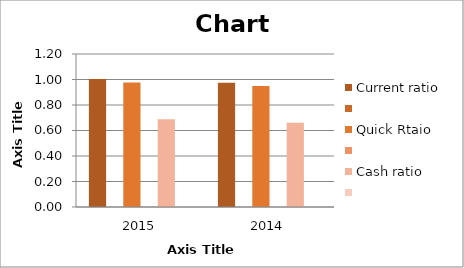
| Category | Current ratio  | Series 1 | Quick Rtaio  | Series 3 | Cash ratio | Series 5 |
|---|---|---|---|---|---|---|
| 2015.0 | 1.003 |  | 0.977 |  | 0.688 |  |
| 2014.0 | 0.974 |  | 0.949 |  | 0.661 |  |